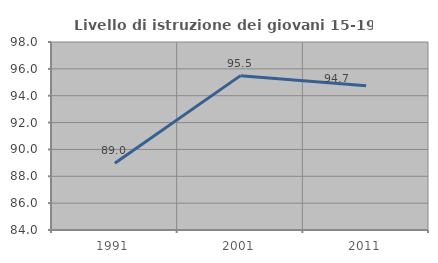
| Category | Livello di istruzione dei giovani 15-19 anni |
|---|---|
| 1991.0 | 88.966 |
| 2001.0 | 95.495 |
| 2011.0 | 94.737 |